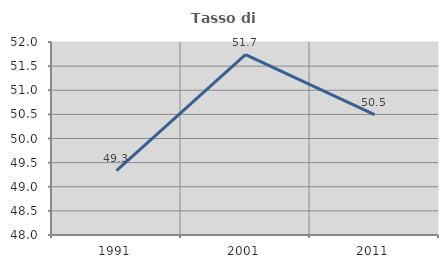
| Category | Tasso di occupazione   |
|---|---|
| 1991.0 | 49.334 |
| 2001.0 | 51.74 |
| 2011.0 | 50.497 |